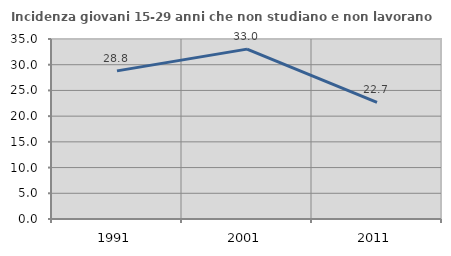
| Category | Incidenza giovani 15-29 anni che non studiano e non lavorano  |
|---|---|
| 1991.0 | 28.8 |
| 2001.0 | 33.03 |
| 2011.0 | 22.671 |